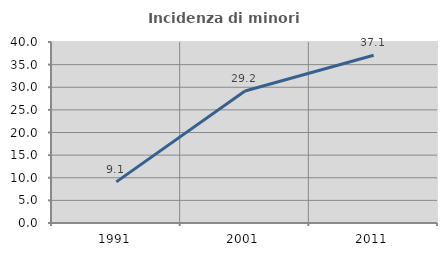
| Category | Incidenza di minori stranieri |
|---|---|
| 1991.0 | 9.091 |
| 2001.0 | 29.167 |
| 2011.0 | 37.079 |